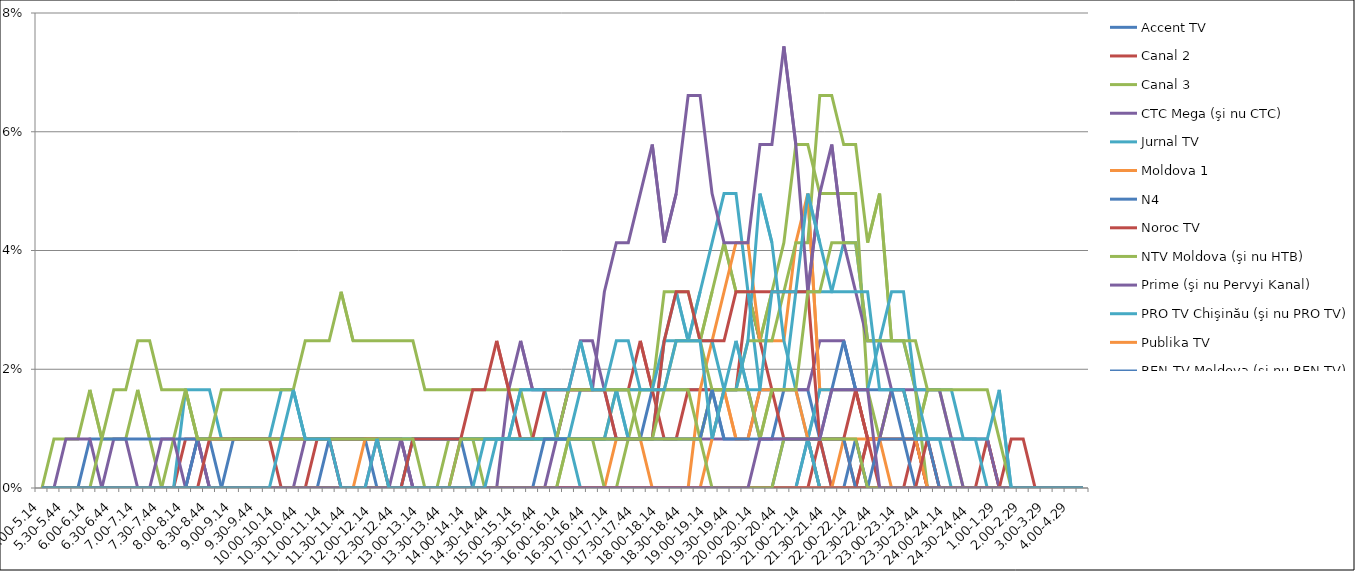
| Category | Accent TV | Canal 2 | Canal 3 | CTC Mega (şi nu CTC) | Jurnal TV | Moldova 1 | N4 | Noroc TV | NTV Moldova (şi nu HTB) | Prime (şi nu Pervyi Kanal) | PRO TV Chişinău (şi nu PRO TV) | Publika TV  | REN-TV Moldova (şi nu REN TV)  | RTR Moldova( şi nu PTP)  | THT Exclusiv (şi nu THT) | TV8 | TVC 21 | TVR MOLDOVA (şi nu TVR) | Canal Regional | Familia Domashniy | ITV | Moldova 2 | Alt canal |
|---|---|---|---|---|---|---|---|---|---|---|---|---|---|---|---|---|---|---|---|---|---|---|---|
| 5.00-5.14 | 0 | 0 | 0 | 0 | 0 | 0 | 0 | 0 | 0 | 0 | 0 | 0 | 0 | 0 | 0 | 0 | 0 | 0 | 0 | 0 | 0 | 0 | 0 |
| 5.15-5.29 | 0 | 0 | 0.008 | 0 | 0 | 0 | 0 | 0 | 0 | 0 | 0 | 0 | 0 | 0 | 0 | 0 | 0 | 0 | 0 | 0 | 0 | 0 | 0 |
| 5.30-5.44 | 0 | 0 | 0.008 | 0 | 0 | 0 | 0 | 0 | 0 | 0.008 | 0 | 0 | 0 | 0 | 0 | 0 | 0 | 0 | 0 | 0 | 0 | 0 | 0 |
| 5.45-5.59 | 0 | 0 | 0.008 | 0 | 0 | 0 | 0 | 0 | 0 | 0.008 | 0 | 0 | 0 | 0 | 0 | 0 | 0 | 0 | 0 | 0 | 0 | 0 | 0 |
| 6.00-6.14 | 0 | 0 | 0.017 | 0 | 0 | 0 | 0.008 | 0 | 0 | 0.008 | 0 | 0 | 0 | 0 | 0 | 0 | 0 | 0 | 0 | 0 | 0 | 0 | 0 |
| 6.15-6.29 | 0 | 0 | 0.008 | 0 | 0 | 0 | 0.008 | 0 | 0 | 0 | 0 | 0 | 0 | 0 | 0.008 | 0 | 0 | 0 | 0 | 0 | 0 | 0 | 0 |
| 6.30-6.44 | 0 | 0 | 0.008 | 0.008 | 0 | 0 | 0.008 | 0 | 0 | 0 | 0 | 0 | 0 | 0 | 0.017 | 0 | 0 | 0 | 0 | 0 | 0 | 0 | 0 |
| 6.45-6.59 | 0 | 0 | 0.008 | 0.008 | 0 | 0 | 0.008 | 0 | 0 | 0 | 0 | 0 | 0 | 0 | 0.017 | 0 | 0 | 0 | 0 | 0 | 0 | 0 | 0 |
| 7.00-7.14 | 0 | 0 | 0.017 | 0 | 0 | 0 | 0.008 | 0 | 0 | 0 | 0 | 0 | 0 | 0 | 0.025 | 0 | 0 | 0 | 0 | 0 | 0 | 0 | 0 |
| 7.15-7.29 | 0 | 0 | 0.008 | 0 | 0 | 0 | 0.008 | 0 | 0 | 0 | 0 | 0 | 0 | 0 | 0.025 | 0 | 0 | 0 | 0 | 0 | 0 | 0 | 0 |
| 7.30-7.44 | 0 | 0 | 0 | 0 | 0 | 0 | 0.008 | 0 | 0 | 0.008 | 0 | 0 | 0 | 0 | 0.017 | 0 | 0 | 0 | 0 | 0 | 0 | 0 | 0 |
| 7.45-7.59 | 0 | 0 | 0 | 0 | 0 | 0 | 0.008 | 0 | 0.008 | 0.008 | 0 | 0 | 0 | 0 | 0.017 | 0 | 0 | 0 | 0 | 0 | 0 | 0 | 0 |
| 8.00-8.14 | 0 | 0.008 | 0 | 0 | 0.017 | 0 | 0.008 | 0 | 0.017 | 0 | 0 | 0 | 0 | 0 | 0.017 | 0 | 0 | 0 | 0 | 0 | 0 | 0 | 0 |
| 8.15-8.29 | 0 | 0.008 | 0 | 0 | 0.017 | 0 | 0.008 | 0 | 0.008 | 0.008 | 0 | 0 | 0.008 | 0 | 0.008 | 0 | 0 | 0 | 0 | 0 | 0 | 0 | 0 |
| 8.30-8.44 | 0 | 0.008 | 0 | 0 | 0.017 | 0 | 0 | 0 | 0.008 | 0 | 0 | 0 | 0.008 | 0.008 | 0.008 | 0 | 0 | 0 | 0 | 0 | 0 | 0 | 0 |
| 8.45-8.59 | 0 | 0.008 | 0 | 0 | 0.008 | 0 | 0 | 0 | 0.017 | 0 | 0 | 0 | 0 | 0.008 | 0.008 | 0 | 0 | 0 | 0 | 0 | 0 | 0 | 0 |
| 9.00-9.14 | 0.008 | 0.008 | 0 | 0 | 0.008 | 0 | 0 | 0 | 0.017 | 0 | 0 | 0 | 0 | 0.008 | 0.008 | 0 | 0 | 0 | 0 | 0 | 0 | 0 | 0 |
| 9.15-9.29 | 0.008 | 0.008 | 0 | 0 | 0.008 | 0 | 0 | 0 | 0.017 | 0 | 0 | 0 | 0 | 0.008 | 0.008 | 0 | 0 | 0 | 0 | 0 | 0 | 0 | 0 |
| 9.30-9.44 | 0.008 | 0.008 | 0 | 0 | 0.008 | 0 | 0 | 0 | 0.017 | 0 | 0 | 0 | 0 | 0.008 | 0.008 | 0 | 0 | 0 | 0 | 0 | 0 | 0 | 0 |
| 9.45-9.59 | 0.008 | 0.008 | 0 | 0 | 0.008 | 0 | 0 | 0 | 0.017 | 0 | 0 | 0 | 0 | 0.008 | 0.008 | 0 | 0 | 0 | 0 | 0 | 0 | 0 | 0 |
| 10.00-10.14 | 0.008 | 0 | 0 | 0 | 0.017 | 0 | 0 | 0 | 0.017 | 0 | 0 | 0 | 0 | 0.008 | 0.008 | 0 | 0 | 0 | 0 | 0 | 0 | 0 | 0.008 |
| 10.15-10.29 | 0.008 | 0 | 0 | 0 | 0.017 | 0 | 0 | 0 | 0.017 | 0 | 0 | 0 | 0 | 0.008 | 0.008 | 0 | 0 | 0 | 0 | 0 | 0 | 0 | 0.017 |
| 10.30-10.44 | 0.008 | 0 | 0 | 0.008 | 0.008 | 0 | 0 | 0 | 0.025 | 0 | 0 | 0 | 0 | 0.008 | 0.008 | 0 | 0 | 0 | 0 | 0 | 0 | 0 | 0.008 |
| 10.45-10.59 | 0.008 | 0.008 | 0 | 0.008 | 0.008 | 0 | 0 | 0 | 0.025 | 0 | 0 | 0 | 0 | 0.008 | 0.008 | 0 | 0 | 0 | 0 | 0 | 0 | 0 | 0.008 |
| 11.00-11.14 | 0.008 | 0.008 | 0 | 0.008 | 0.008 | 0 | 0.008 | 0 | 0.025 | 0 | 0 | 0 | 0 | 0.008 | 0.008 | 0 | 0 | 0 | 0 | 0 | 0 | 0 | 0.008 |
| 11.15-11.29 | 0.008 | 0 | 0 | 0 | 0.008 | 0 | 0.008 | 0 | 0.033 | 0 | 0 | 0 | 0 | 0.008 | 0.008 | 0 | 0 | 0 | 0 | 0 | 0 | 0 | 0 |
| 11.30-11.44 | 0.008 | 0 | 0 | 0 | 0.008 | 0 | 0.008 | 0 | 0.025 | 0 | 0 | 0 | 0 | 0.008 | 0.008 | 0 | 0 | 0 | 0 | 0 | 0 | 0 | 0 |
| 11.45-11.59 | 0.008 | 0 | 0 | 0 | 0.008 | 0 | 0.008 | 0 | 0.025 | 0 | 0 | 0.008 | 0 | 0.008 | 0.008 | 0 | 0 | 0 | 0 | 0 | 0 | 0 | 0 |
| 12.00-12.14 | 0.008 | 0 | 0 | 0 | 0.008 | 0 | 0 | 0 | 0.025 | 0.008 | 0 | 0.008 | 0 | 0.008 | 0.008 | 0 | 0 | 0 | 0 | 0 | 0 | 0 | 0.008 |
| 12.15-12.29 | 0.008 | 0 | 0 | 0 | 0.008 | 0 | 0 | 0 | 0.025 | 0.008 | 0 | 0 | 0 | 0 | 0.008 | 0 | 0 | 0 | 0 | 0 | 0 | 0 | 0 |
| 12.30-12.44 | 0.008 | 0 | 0 | 0.008 | 0.008 | 0 | 0 | 0 | 0.025 | 0.008 | 0 | 0 | 0 | 0 | 0.008 | 0 | 0 | 0 | 0 | 0 | 0 | 0 | 0 |
| 12.45-12.59 | 0.008 | 0 | 0 | 0 | 0.008 | 0 | 0.008 | 0 | 0.025 | 0 | 0.008 | 0 | 0 | 0.008 | 0.008 | 0 | 0 | 0 | 0 | 0 | 0 | 0 | 0 |
| 13.00-13.14 | 0.008 | 0 | 0 | 0 | 0.008 | 0 | 0.008 | 0 | 0.017 | 0 | 0.008 | 0 | 0 | 0.008 | 0 | 0 | 0 | 0 | 0 | 0 | 0 | 0 | 0 |
| 13.15-13.29 | 0.008 | 0 | 0 | 0 | 0.008 | 0 | 0.008 | 0 | 0.017 | 0 | 0.008 | 0 | 0 | 0.008 | 0 | 0 | 0 | 0 | 0 | 0 | 0 | 0 | 0 |
| 13.30-13.44 | 0.008 | 0 | 0.008 | 0 | 0.008 | 0 | 0.008 | 0 | 0.017 | 0 | 0.008 | 0 | 0 | 0.008 | 0 | 0 | 0 | 0 | 0 | 0 | 0 | 0 | 0 |
| 13.45-13.59 | 0.008 | 0.008 | 0.008 | 0 | 0.008 | 0 | 0.008 | 0 | 0.017 | 0 | 0.008 | 0 | 0 | 0.008 | 0.008 | 0 | 0 | 0 | 0 | 0 | 0 | 0 | 0 |
| 14.00-14.14 | 0.008 | 0.008 | 0.008 | 0 | 0.008 | 0 | 0 | 0 | 0.017 | 0 | 0.008 | 0 | 0 | 0.017 | 0.008 | 0 | 0 | 0 | 0 | 0 | 0 | 0 | 0 |
| 14.15-14.29 | 0.008 | 0.008 | 0 | 0 | 0.008 | 0 | 0 | 0 | 0.017 | 0 | 0.008 | 0 | 0 | 0.017 | 0.008 | 0 | 0.008 | 0 | 0 | 0 | 0 | 0 | 0 |
| 14.30-14.44 | 0.008 | 0.008 | 0 | 0 | 0.008 | 0 | 0 | 0 | 0.017 | 0 | 0.008 | 0 | 0 | 0.025 | 0.008 | 0 | 0.008 | 0 | 0 | 0 | 0 | 0 | 0.008 |
| 14.45-14.59 | 0.008 | 0.008 | 0 | 0 | 0.008 | 0 | 0 | 0 | 0.017 | 0.017 | 0.008 | 0 | 0 | 0.017 | 0.008 | 0 | 0.008 | 0 | 0 | 0 | 0 | 0 | 0.008 |
| 15.00-15.14 | 0.008 | 0.008 | 0 | 0 | 0.017 | 0 | 0 | 0 | 0.017 | 0.025 | 0.008 | 0 | 0 | 0.008 | 0.008 | 0 | 0.008 | 0 | 0 | 0 | 0 | 0 | 0.017 |
| 15.15-15.29 | 0.008 | 0.008 | 0 | 0 | 0.017 | 0 | 0 | 0 | 0.008 | 0.017 | 0.008 | 0 | 0 | 0.008 | 0.008 | 0 | 0.008 | 0 | 0 | 0 | 0 | 0 | 0.017 |
| 15.30-15.44 | 0.008 | 0.008 | 0 | 0 | 0.017 | 0 | 0 | 0 | 0.008 | 0.017 | 0.008 | 0 | 0 | 0.017 | 0.008 | 0 | 0.008 | 0 | 0.008 | 0 | 0 | 0 | 0.017 |
| 15.45-15.59 | 0.008 | 0.008 | 0 | 0.008 | 0.008 | 0 | 0 | 0 | 0.008 | 0.017 | 0.008 | 0 | 0 | 0.017 | 0.008 | 0 | 0.008 | 0 | 0.008 | 0 | 0 | 0 | 0.017 |
| 16.00-16.14 | 0.008 | 0.017 | 0.008 | 0.017 | 0.008 | 0 | 0 | 0 | 0.008 | 0.017 | 0.008 | 0 | 0 | 0.017 | 0.017 | 0 | 0.008 | 0 | 0.008 | 0 | 0.008 | 0 | 0.017 |
| 16.15-16.29 | 0.008 | 0.017 | 0.008 | 0.025 | 0.017 | 0 | 0 | 0 | 0.008 | 0.017 | 0.008 | 0 | 0 | 0.017 | 0.017 | 0 | 0 | 0 | 0.008 | 0 | 0.008 | 0 | 0.025 |
| 16.30-16.44 | 0.008 | 0.017 | 0.008 | 0.025 | 0.017 | 0 | 0 | 0 | 0.008 | 0.017 | 0.008 | 0 | 0 | 0.017 | 0.017 | 0 | 0 | 0 | 0.008 | 0 | 0.008 | 0 | 0.017 |
| 16.45-16.59 | 0.008 | 0.017 | 0.008 | 0.017 | 0.017 | 0 | 0 | 0 | 0 | 0.033 | 0.008 | 0 | 0 | 0.017 | 0.017 | 0 | 0 | 0 | 0.008 | 0 | 0.008 | 0 | 0.017 |
| 17.00-17.14 | 0.008 | 0.017 | 0.017 | 0.008 | 0.017 | 0.008 | 0 | 0 | 0 | 0.041 | 0.017 | 0 | 0 | 0.008 | 0.017 | 0 | 0 | 0 | 0.008 | 0 | 0.008 | 0 | 0.025 |
| 17.15-17.29 | 0.008 | 0.017 | 0.017 | 0.008 | 0.017 | 0.008 | 0 | 0 | 0.008 | 0.041 | 0.008 | 0 | 0 | 0.008 | 0.017 | 0 | 0 | 0 | 0.008 | 0 | 0.008 | 0 | 0.025 |
| 17.30-17.44 | 0.008 | 0.025 | 0.017 | 0.008 | 0.017 | 0.008 | 0 | 0 | 0.017 | 0.05 | 0.008 | 0 | 0 | 0.008 | 0.008 | 0 | 0 | 0 | 0.008 | 0 | 0.008 | 0 | 0.017 |
| 17.45-17.59 | 0.017 | 0.017 | 0.017 | 0.008 | 0.017 | 0 | 0 | 0 | 0.017 | 0.058 | 0.008 | 0 | 0 | 0.008 | 0.008 | 0 | 0 | 0 | 0.008 | 0 | 0.008 | 0 | 0.017 |
| 18.00-18.14 | 0.017 | 0.008 | 0.033 | 0.008 | 0.025 | 0 | 0 | 0 | 0.017 | 0.041 | 0.025 | 0 | 0 | 0.025 | 0.017 | 0 | 0 | 0 | 0.008 | 0 | 0.008 | 0 | 0.017 |
| 18.15-18.29 | 0.017 | 0.008 | 0.033 | 0.008 | 0.033 | 0 | 0 | 0 | 0.017 | 0.05 | 0.025 | 0 | 0 | 0.033 | 0.025 | 0 | 0 | 0 | 0.008 | 0 | 0.008 | 0 | 0.025 |
| 18.30-18.44 | 0.017 | 0.017 | 0.033 | 0.008 | 0.025 | 0 | 0 | 0 | 0.017 | 0.066 | 0.025 | 0 | 0 | 0.033 | 0.025 | 0 | 0 | 0 | 0.008 | 0 | 0.008 | 0 | 0.025 |
| 18.45-18.59 | 0.017 | 0.017 | 0.025 | 0.008 | 0.033 | 0.017 | 0 | 0 | 0.008 | 0.066 | 0.025 | 0 | 0 | 0.025 | 0.025 | 0 | 0 | 0 | 0.008 | 0 | 0.008 | 0 | 0.025 |
| 19.00-19.14 | 0.017 | 0.017 | 0.033 | 0.008 | 0.041 | 0.025 | 0 | 0 | 0.017 | 0.05 | 0.025 | 0.008 | 0 | 0.025 | 0.017 | 0 | 0 | 0 | 0.017 | 0 | 0 | 0 | 0.008 |
| 19.15-19.29 | 0.017 | 0.017 | 0.041 | 0.008 | 0.05 | 0.033 | 0 | 0 | 0.017 | 0.041 | 0.017 | 0.017 | 0 | 0.025 | 0.017 | 0 | 0 | 0 | 0.008 | 0 | 0 | 0 | 0.017 |
| 19.30-19.44 | 0.017 | 0.017 | 0.033 | 0.008 | 0.05 | 0.041 | 0 | 0 | 0.017 | 0.041 | 0.017 | 0.008 | 0 | 0.033 | 0.017 | 0 | 0 | 0 | 0.008 | 0 | 0 | 0 | 0.025 |
| 19.45-19.59 | 0.017 | 0.033 | 0.033 | 0.008 | 0.033 | 0.041 | 0 | 0 | 0.025 | 0.041 | 0.025 | 0.008 | 0 | 0.033 | 0.017 | 0 | 0 | 0 | 0.008 | 0 | 0 | 0 | 0.017 |
| 20.00-20.14 | 0.008 | 0.025 | 0.025 | 0.017 | 0.017 | 0.025 | 0 | 0 | 0.025 | 0.058 | 0.05 | 0.017 | 0 | 0.033 | 0.008 | 0 | 0 | 0 | 0.008 | 0 | 0 | 0.008 | 0.017 |
| 20.15-20.29 | 0.008 | 0.017 | 0.033 | 0.017 | 0.017 | 0.025 | 0 | 0 | 0.025 | 0.058 | 0.041 | 0.017 | 0 | 0.033 | 0.017 | 0 | 0 | 0 | 0.008 | 0 | 0 | 0.008 | 0.033 |
| 20.30-20.44 | 0.017 | 0.008 | 0.041 | 0.017 | 0.017 | 0.025 | 0 | 0 | 0.033 | 0.074 | 0.025 | 0.017 | 0.008 | 0.033 | 0.017 | 0 | 0 | 0 | 0.008 | 0 | 0.008 | 0.008 | 0.033 |
| 20.45-20.59 | 0.017 | 0.008 | 0.058 | 0.017 | 0.033 | 0.041 | 0 | 0 | 0.041 | 0.058 | 0.017 | 0.017 | 0.008 | 0.033 | 0.017 | 0 | 0 | 0 | 0.008 | 0 | 0.008 | 0.008 | 0.033 |
| 21.00-21.14 | 0.017 | 0.008 | 0.058 | 0.017 | 0.033 | 0.05 | 0.008 | 0 | 0.041 | 0.033 | 0.008 | 0.008 | 0.008 | 0.033 | 0.033 | 0 | 0.008 | 0 | 0.008 | 0 | 0.008 | 0.008 | 0.05 |
| 21.15-21.29 | 0.008 | 0.008 | 0.05 | 0.025 | 0.033 | 0.017 | 0 | 0.008 | 0.066 | 0.05 | 0.017 | 0 | 0.008 | 0.008 | 0.033 | 0 | 0 | 0 | 0.008 | 0 | 0.008 | 0.008 | 0.041 |
| 21.30-21.44 | 0 | 0 | 0.05 | 0.025 | 0.033 | 0.017 | 0 | 0.008 | 0.066 | 0.058 | 0.017 | 0 | 0.017 | 0.008 | 0.041 | 0 | 0 | 0 | 0.008 | 0 | 0.008 | 0.017 | 0.033 |
| 21.45-21.59 | 0 | 0 | 0.05 | 0.025 | 0.041 | 0.017 | 0 | 0.008 | 0.058 | 0.041 | 0.017 | 0.008 | 0.025 | 0.008 | 0.041 | 0 | 0 | 0 | 0.008 | 0 | 0.008 | 0.017 | 0.033 |
| 22.00-22.14 | 0 | 0 | 0.05 | 0.017 | 0.041 | 0.017 | 0.008 | 0 | 0.058 | 0.033 | 0.017 | 0.008 | 0.017 | 0.017 | 0.041 | 0 | 0 | 0 | 0 | 0 | 0.008 | 0.017 | 0.033 |
| 22.15-22.29 | 0 | 0 | 0.017 | 0.008 | 0.025 | 0.008 | 0 | 0.008 | 0.041 | 0.025 | 0.017 | 0.008 | 0.017 | 0.008 | 0.025 | 0 | 0 | 0 | 0 | 0 | 0 | 0.017 | 0.033 |
| 22.30-22.44 | 0 | 0 | 0.008 | 0.008 | 0.025 | 0.008 | 0 | 0.008 | 0.05 | 0.025 | 0.025 | 0.008 | 0.017 | 0 | 0.025 | 0 | 0 | 0 | 0.008 | 0 | 0 | 0 | 0.017 |
| 22.45-22.59 | 0 | 0 | 0.017 | 0.017 | 0.025 | 0 | 0 | 0.008 | 0.025 | 0.017 | 0.033 | 0.008 | 0.017 | 0 | 0.025 | 0 | 0 | 0 | 0.008 | 0 | 0 | 0 | 0.017 |
| 23.00-23.14 | 0 | 0 | 0.017 | 0.017 | 0.025 | 0 | 0 | 0.008 | 0.025 | 0.017 | 0.033 | 0.008 | 0.008 | 0 | 0.025 | 0 | 0 | 0 | 0.008 | 0 | 0 | 0 | 0.017 |
| 23.15-23.29 | 0 | 0.008 | 0.008 | 0.008 | 0.017 | 0 | 0 | 0.008 | 0.017 | 0.017 | 0.017 | 0.008 | 0 | 0 | 0.025 | 0 | 0 | 0 | 0.008 | 0 | 0 | 0 | 0.008 |
| 23.30-23.44 | 0 | 0 | 0.017 | 0.008 | 0.008 | 0 | 0 | 0 | 0 | 0.017 | 0.017 | 0 | 0 | 0.008 | 0.017 | 0 | 0 | 0 | 0.008 | 0 | 0 | 0 | 0.008 |
| 23.45-23.59 | 0 | 0 | 0.017 | 0.008 | 0.008 | 0 | 0 | 0 | 0 | 0.017 | 0.017 | 0 | 0 | 0 | 0.017 | 0 | 0 | 0 | 0 | 0 | 0 | 0 | 0.008 |
| 24.00-24.14 | 0 | 0 | 0.008 | 0.008 | 0 | 0 | 0 | 0 | 0 | 0.008 | 0.017 | 0 | 0 | 0 | 0.017 | 0 | 0 | 0 | 0 | 0 | 0 | 0 | 0.008 |
| 24.15-24.29 | 0 | 0 | 0 | 0 | 0 | 0 | 0 | 0 | 0 | 0.008 | 0.008 | 0 | 0 | 0 | 0.017 | 0 | 0 | 0 | 0 | 0 | 0 | 0 | 0.008 |
| 24.30-24.44 | 0 | 0 | 0 | 0 | 0 | 0 | 0 | 0 | 0 | 0.008 | 0.008 | 0 | 0 | 0 | 0.017 | 0 | 0 | 0 | 0 | 0 | 0 | 0 | 0.008 |
| 24.45-24.59 | 0 | 0 | 0 | 0 | 0 | 0 | 0 | 0.008 | 0 | 0.008 | 0 | 0 | 0 | 0 | 0.017 | 0 | 0 | 0 | 0 | 0 | 0 | 0 | 0.008 |
| 1.00-1.29 | 0 | 0 | 0 | 0 | 0 | 0 | 0 | 0 | 0 | 0 | 0 | 0 | 0 | 0 | 0.008 | 0 | 0 | 0 | 0 | 0 | 0 | 0 | 0.017 |
| 1.30-1. 59 | 0 | 0 | 0 | 0 | 0 | 0 | 0 | 0 | 0 | 0 | 0 | 0 | 0 | 0.008 | 0 | 0 | 0 | 0 | 0 | 0 | 0 | 0 | 0 |
| 2.00-2.29 | 0 | 0 | 0 | 0 | 0 | 0 | 0 | 0 | 0 | 0 | 0 | 0 | 0 | 0.008 | 0 | 0 | 0 | 0 | 0 | 0 | 0 | 0 | 0 |
| 2.30-2.59 | 0 | 0 | 0 | 0 | 0 | 0 | 0 | 0 | 0 | 0 | 0 | 0 | 0 | 0 | 0 | 0 | 0 | 0 | 0 | 0 | 0 | 0 | 0 |
| 3.00-3.29 | 0 | 0 | 0 | 0 | 0 | 0 | 0 | 0 | 0 | 0 | 0 | 0 | 0 | 0 | 0 | 0 | 0 | 0 | 0 | 0 | 0 | 0 | 0 |
| 3.30-3.59 | 0 | 0 | 0 | 0 | 0 | 0 | 0 | 0 | 0 | 0 | 0 | 0 | 0 | 0 | 0 | 0 | 0 | 0 | 0 | 0 | 0 | 0 | 0 |
| 4.00-4.29 | 0 | 0 | 0 | 0 | 0 | 0 | 0 | 0 | 0 | 0 | 0 | 0 | 0 | 0 | 0 | 0 | 0 | 0 | 0 | 0 | 0 | 0 | 0 |
| 4.30-4.59 | 0 | 0 | 0 | 0 | 0 | 0 | 0 | 0 | 0 | 0 | 0 | 0 | 0 | 0 | 0 | 0 | 0 | 0 | 0 | 0 | 0 | 0 | 0 |